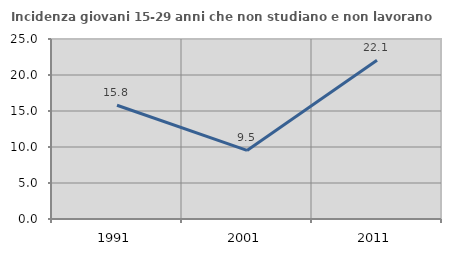
| Category | Incidenza giovani 15-29 anni che non studiano e non lavorano  |
|---|---|
| 1991.0 | 15.799 |
| 2001.0 | 9.524 |
| 2011.0 | 22.059 |